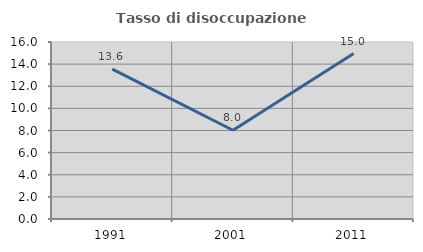
| Category | Tasso di disoccupazione giovanile  |
|---|---|
| 1991.0 | 13.55 |
| 2001.0 | 8.022 |
| 2011.0 | 14.958 |